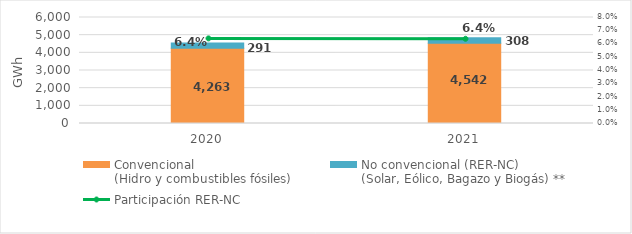
| Category | Convencional
(Hidro y combustibles fósiles) | No convencional (RER-NC)
(Solar, Eólico, Bagazo y Biogás) ** |
|---|---|---|
| 2020.0 | 4262.855 | 290.769 |
| 2021.0 | 4542.448 | 308.243 |